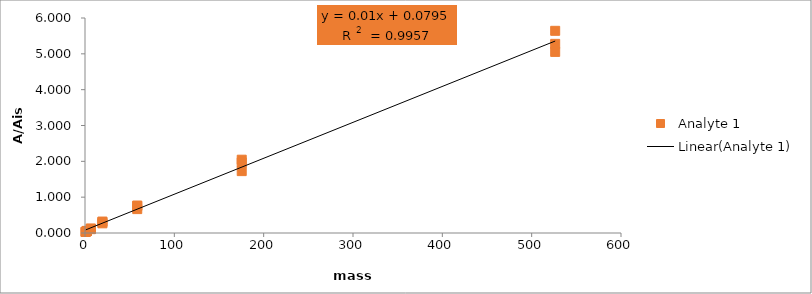
| Category | Analyte 1 |
|---|---|
| 0.7219708330308661 | 0.034 |
| 0.7219708330308661 | 0.032 |
| 0.7219708330308661 | 0.029 |
| 2.165912499092598 | 0.056 |
| 2.165912499092598 | 0.059 |
| 2.165912499092598 | 0.054 |
| 6.497737497277795 | 0.122 |
| 6.497737497277795 | 0.12 |
| 6.497737497277795 | 0.107 |
| 19.493212491833383 | 0.319 |
| 19.493212491833383 | 0.304 |
| 19.493212491833383 | 0.27 |
| 58.47963747550015 | 0.749 |
| 58.47963747550015 | 0.767 |
| 58.47963747550015 | 0.667 |
| 175.43891242650045 | 2.046 |
| 175.43891242650045 | 1.971 |
| 175.43891242650045 | 1.727 |
| 526.3167372795014 | 5.279 |
| 526.3167372795014 | 5.642 |
| 526.3167372795014 | 5.053 |